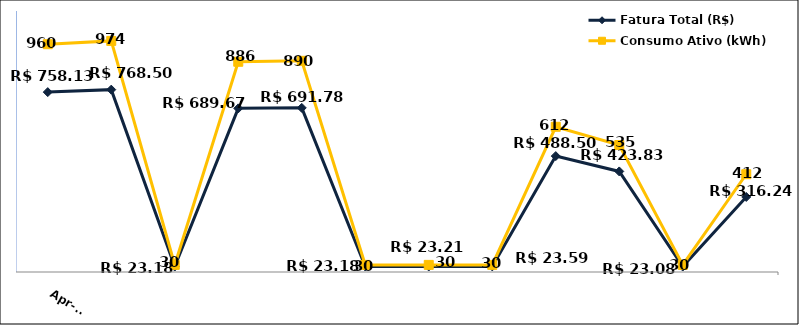
| Category | Fatura Total (R$) |
|---|---|
| 2023-04-01 | 758.13 |
| 2023-05-01 | 768.5 |
| 2023-06-01 | 23.18 |
| 2023-07-01 | 689.67 |
| 2023-08-01 | 691.78 |
| 2023-09-01 | 23.18 |
| 2023-10-01 | 23.21 |
| 2023-11-01 | 23.59 |
| 2023-12-01 | 488.5 |
| 2024-01-01 | 423.83 |
| 2024-02-01 | 23.08 |
| 2024-03-01 | 316.24 |